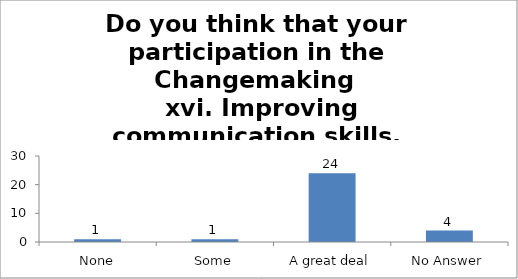
| Category | Do you think that your participation in the Changemaking 
 xvi. Improving communication skills. |
|---|---|
| None | 1 |
| Some | 1 |
| A great deal | 24 |
| No Answer | 4 |